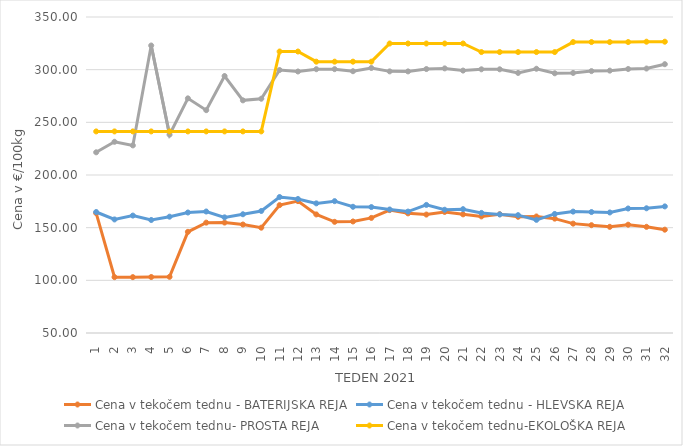
| Category | Cena v tekočem tednu - BATERIJSKA REJA | Cena v tekočem tednu - HLEVSKA REJA | Cena v tekočem tednu- PROSTA REJA | Cena v tekočem tednu-EKOLOŠKA REJA |
|---|---|---|---|---|
| 1.0 | 163.81 | 164.86 | 221.55 | 241.38 |
| 2.0 | 103.02 | 157.81 | 231.55 | 241.38 |
| 3.0 | 103.03 | 161.48 | 228.1 | 241.38 |
| 4.0 | 103.15 | 157.29 | 322.93 | 241.38 |
| 5.0 | 103.34 | 160.43 | 238.28 | 241.38 |
| 6.0 | 146.03 | 164.39 | 272.76 | 241.38 |
| 7.0 | 154.77 | 165.34 | 261.55 | 241.38 |
| 8.0 | 154.86 | 159.79 | 293.97 | 241.38 |
| 9.0 | 153 | 162.73 | 270.86 | 241.38 |
| 10.0 | 149.98 | 165.85 | 272.41 | 241.38 |
| 11.0 | 171.4 | 179.09 | 299.66 | 317.24 |
| 12.0 | 175.2 | 177.21 | 298.27 | 317.24 |
| 13.0 | 162.57 | 173.07 | 300.45 | 307.59 |
| 14.0 | 155.55 | 175.17 | 300.49 | 307.59 |
| 15.0 | 155.88 | 169.83 | 298.52 | 307.59 |
| 16.0 | 159.26 | 169.55 | 301.6 | 307.59 |
| 17.0 | 166.66 | 167.25 | 298.38 | 324.83 |
| 18.0 | 163.58 | 165.28 | 298.35 | 324.83 |
| 19.0 | 162.44 | 171.6 | 300.59 | 324.83 |
| 20.0 | 164.94 | 167.01 | 301.21 | 324.83 |
| 21.0 | 162.64 | 167.56 | 299.14 | 324.83 |
| 22.0 | 160.68 | 164.01 | 300.34 | 316.72 |
| 23.0 | 162.75 | 162.58 | 300.35 | 316.72 |
| 24.0 | 160.34 | 161.89 | 296.9 | 316.72 |
| 25.0 | 160.61 | 157.42 | 300.86 | 316.72 |
| 26.0 | 158.57 | 163.03 | 296.55 | 316.72 |
| 27.0 | 153.83 | 165.23 | 296.9 | 326.21 |
| 28.0 | 152.35 | 164.83 | 298.63 | 326.21 |
| 29.0 | 150.79 | 164.42 | 299.08 | 326.21 |
| 30.0 | 152.82 | 168.2 | 300.63 | 326.21 |
| 31.0 | 150.8 | 168.4 | 301.07 | 326.55 |
| 32.0 | 148.1 | 170.19 | 305.2 | 326.55 |